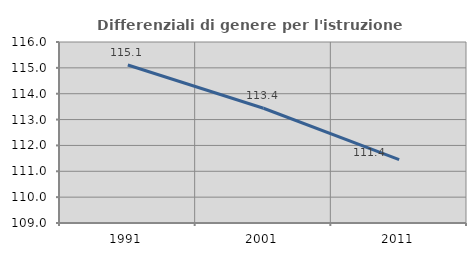
| Category | Differenziali di genere per l'istruzione superiore |
|---|---|
| 1991.0 | 115.109 |
| 2001.0 | 113.438 |
| 2011.0 | 111.448 |